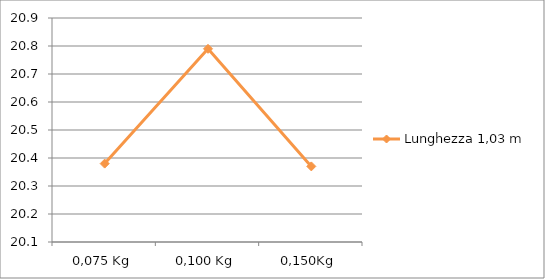
| Category | Lunghezza 1,03 m |
|---|---|
| 0,075 Kg | 20.38 |
| 0,100 Kg | 20.79 |
| 0,150Kg | 20.37 |